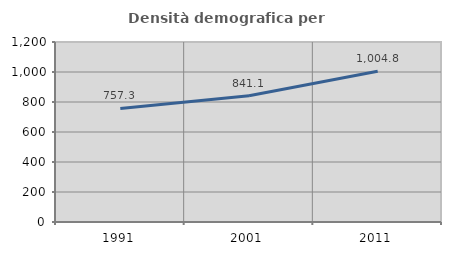
| Category | Densità demografica |
|---|---|
| 1991.0 | 757.335 |
| 2001.0 | 841.069 |
| 2011.0 | 1004.817 |